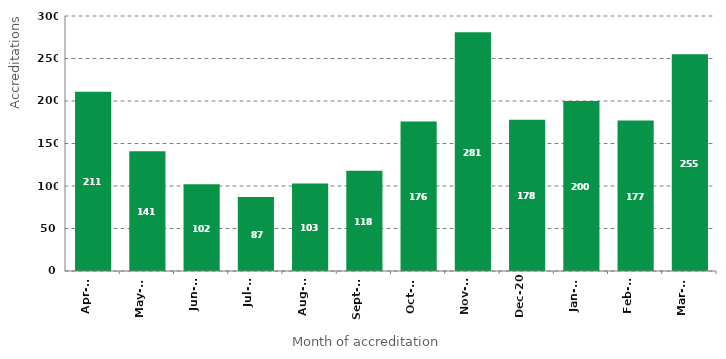
| Category | Series 0 |
|---|---|
| 2020-04-01 | 211 |
| 2020-05-01 | 141 |
| 2020-06-01 | 102 |
| 2020-07-01 | 87 |
| 2020-08-01 | 103 |
| 2020-09-01 | 118 |
| 2020-10-01 | 176 |
| 2020-11-01 | 281 |
| 2020-12-01 | 178 |
| 2021-01-01 | 200 |
| 2021-02-01 | 177 |
| 2021-03-01 | 255 |